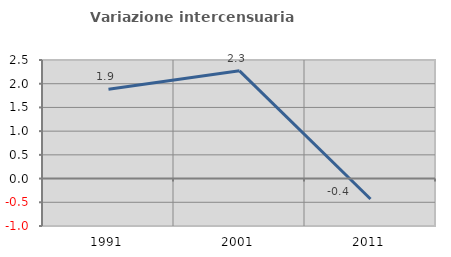
| Category | Variazione intercensuaria annua |
|---|---|
| 1991.0 | 1.884 |
| 2001.0 | 2.271 |
| 2011.0 | -0.43 |